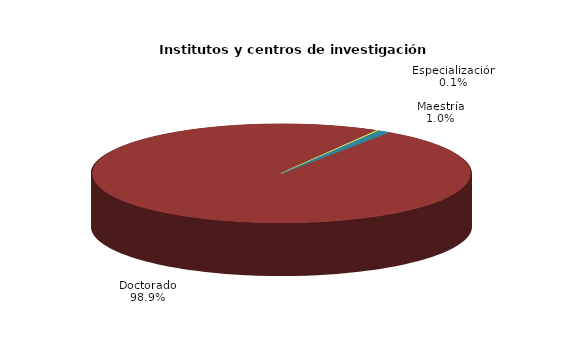
| Category | Series 0 |
|---|---|
| Licenciatura | 0 |
| Especialización | 2 |
| Maestría | 17 |
| Doctorado | 1660 |